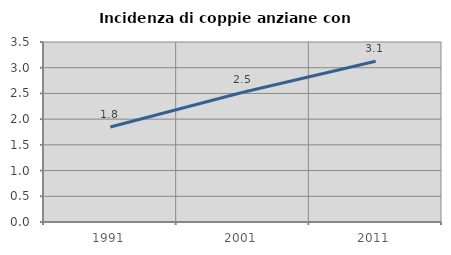
| Category | Incidenza di coppie anziane con figli |
|---|---|
| 1991.0 | 1.848 |
| 2001.0 | 2.523 |
| 2011.0 | 3.125 |